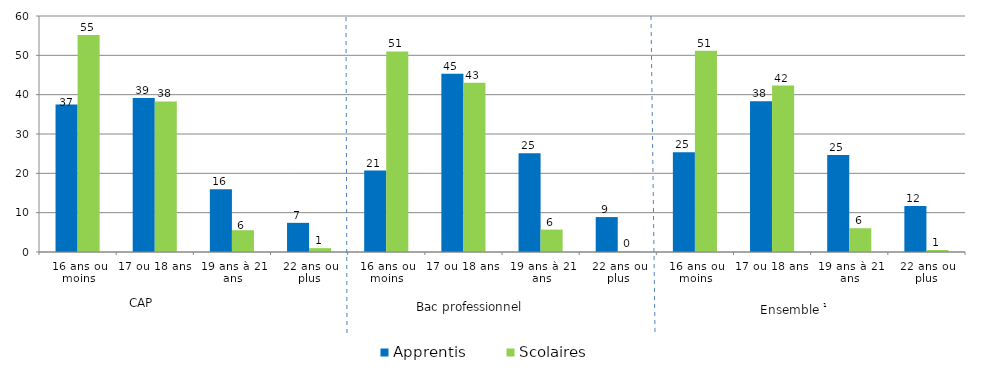
| Category | Apprentis | Scolaires |
|---|---|---|
| 16 ans ou moins | 37.47 | 55.2 |
| 17 ou 18 ans | 39.13 | 38.27 |
| 19 ans à 21 ans | 15.97 | 5.54 |
| 22 ans ou plus | 7.41 | 0.98 |
| 16 ans ou moins | 20.72 | 50.99 |
| 17 ou 18 ans | 45.32 | 43.05 |
| 19 ans à 21 ans | 25.09 | 5.7 |
| 22 ans ou plus | 8.88 | 0.27 |
| 16 ans ou moins | 25.35 | 51.15 |
| 17 ou 18 ans | 38.32 | 42.3 |
| 19 ans à 21 ans | 24.64 | 6.04 |
| 22 ans ou plus | 11.69 | 0.51 |